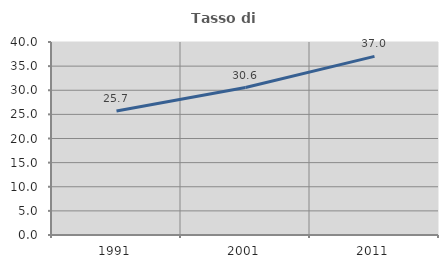
| Category | Tasso di occupazione   |
|---|---|
| 1991.0 | 25.681 |
| 2001.0 | 30.568 |
| 2011.0 | 37.025 |